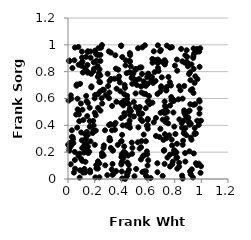
| Category | Series 0 |
|---|---|
| 0.9206579963663208 | 0.036 |
| 0.4158077181605829 | 0.157 |
| 0.3120428770809936 | 0.306 |
| 0.8353106009330821 | 0.444 |
| 0.7339869307414821 | 0.534 |
| 0.21308055101903886 | 0.079 |
| 0.28270051747507824 | 0.625 |
| 0.9456667624345371 | 0.935 |
| 0.08271187156841116 | 0.51 |
| 0.3836603406586898 | 0.765 |
| 0.5448585949675732 | 0.446 |
| 0.7635212476554524 | 0.722 |
| 0.5504686050921789 | 0.832 |
| 0.4056419928539269 | 0.329 |
| 0.48161962206379433 | 0.709 |
| 0.4021259850755091 | 0.283 |
| 0.7273541224507231 | 0.544 |
| 0.2598293609247199 | 0.665 |
| 0.8530634626550466 | 0.417 |
| 0.45638774144367006 | 0.557 |
| 0.30821040089644225 | 0.403 |
| 0.7743683591543493 | 0.611 |
| 0.46207957422139495 | 0.882 |
| 0.23543787546274828 | 0.013 |
| 0.9670457039037931 | 0.104 |
| 0.4400476172596531 | 0.789 |
| 0.4431681908915374 | 0.595 |
| 0.23539181364033687 | 0.117 |
| 0.22451633668062942 | 0.078 |
| 0.4222119321072056 | 0.491 |
| 0.7659264997425803 | 0.548 |
| 0.943451809159553 | 0.191 |
| 0.1052541292295466 | 0.905 |
| 0.9285462002775313 | 0.072 |
| 0.5384748120413075 | 0.536 |
| 0.09922966054547953 | 0.347 |
| 0.949910518939072 | 0.341 |
| 0.20065670655835888 | 0.494 |
| 0.20310304100490315 | 0.626 |
| 0.8194285080062899 | 0.077 |
| 0.5844049880543402 | 0.057 |
| 0.4245124199888307 | 0.701 |
| 0.7957365921333248 | 0.583 |
| 0.5113162440353053 | 0.075 |
| 0.3892200685994344 | 0.72 |
| 0.22201160205907025 | 0.842 |
| 0.993907332759356 | 0.046 |
| 0.5468281498382376 | 0.146 |
| 0.7265102340048437 | 0.853 |
| 0.42182547996855874 | 0.633 |
| 0.9105993135475782 | 0.206 |
| 0.213982639319976 | 0.882 |
| 0.45675928131970034 | 0.069 |
| 0.6337600474479511 | 0.867 |
| 0.3308143528940674 | 0.544 |
| 0.17433334105003712 | 0.784 |
| 0.4629848237053344 | 0.524 |
| 0.465089344490737 | 0.874 |
| 0.9150889705289293 | 0.057 |
| 0.5512959611973434 | 0.645 |
| 0.4782303546606073 | 0.272 |
| 0.8705799180205531 | 0.345 |
| 0.2277124982287225 | 0.923 |
| 0.01112948284223116 | 0.229 |
| 0.05082214313926906 | 0.202 |
| 0.7855892328342527 | 0.129 |
| 0.876214572791075 | 0.867 |
| 0.5985813824788243 | 0.375 |
| 0.5939450579727724 | 0.184 |
| 0.15911137667687214 | 0.203 |
| 0.871272367851718 | 0.511 |
| 0.06389019896030526 | 0.695 |
| 0.7648062874689028 | 0.181 |
| 0.023321956539000453 | 0.247 |
| 0.3470115873342328 | 0.404 |
| 0.4431112977337718 | 0.046 |
| 0.4718060592533276 | 0.507 |
| 0.7792253778191666 | 0.983 |
| 0.12958702128835503 | 0.826 |
| 0.24168110020162487 | 0.653 |
| 0.10893347105673439 | 0.516 |
| 0.8910697622226316 | 0.873 |
| 0.37617730925346315 | 0.815 |
| 0.1996728586670031 | 0.601 |
| 0.7254110164333968 | 0.491 |
| 0.15147871556221507 | 0.193 |
| 0.9504573136855049 | 0.38 |
| 0.1352611008309799 | 0.91 |
| 0.39672147773410876 | 0.279 |
| 0.538240381553302 | 0.831 |
| 0.11910773708450931 | 0.197 |
| 0.9423875325477266 | 0.82 |
| 0.46391360395979586 | 0.938 |
| 0.8130478310451714 | 0.198 |
| 0.3207285795626817 | 0.942 |
| 0.9661767191671596 | 0.949 |
| 0.29467048754694347 | 0.029 |
| 0.4660287046007808 | 0.923 |
| 0.32213281223442497 | 0.746 |
| 0.464483341374274 | 0.478 |
| 0.08434316095264624 | 0.431 |
| 0.5570111082573587 | 0.432 |
| 0.0013983276838097289 | 0.255 |
| 0.9801957261488091 | 0.402 |
| 0.77238509620792 | 0.697 |
| 0.8185539464837522 | 0.161 |
| 0.7961214594318241 | 0.212 |
| 0.5915672727278681 | 0.396 |
| 0.4207207834494755 | 0.469 |
| 0.008671611902048957 | 0.882 |
| 0.9076809227668415 | 0.782 |
| 0.5973254152104879 | 0.44 |
| 0.780407533987411 | 0.25 |
| 0.7453705278236127 | 0.502 |
| 0.9545694579969923 | 0.765 |
| 0.41908205053970743 | 0.204 |
| 0.028572492882195547 | 0.363 |
| 0.5055852287548122 | 0.815 |
| 0.26714268041988587 | 0.176 |
| 0.188762867013501 | 0.433 |
| 0.5934806583749638 | 0.01 |
| 0.24109285320952015 | 0.722 |
| 0.3550657296688981 | 0.922 |
| 0.1392213864366592 | 0.579 |
| 0.6860443283646659 | 0.313 |
| 0.7976810002735821 | 0.214 |
| 0.6931102946344303 | 0.374 |
| 0.9372300836659356 | 0.011 |
| 0.047436343731645805 | 0.885 |
| 0.1686045664436286 | 0.281 |
| 0.07773162321682887 | 0.984 |
| 0.6502205833137428 | 0.797 |
| 0.16388107222321982 | 0.432 |
| 0.5916074672103301 | 0.205 |
| 0.35937850822188167 | 0.823 |
| 0.5073067200827881 | 0.738 |
| 0.36444032194835047 | 0.673 |
| 0.7192081990578212 | 0.211 |
| 0.9868696673002595 | 0.578 |
| 0.7855783872839376 | 0.592 |
| 0.7652555576892625 | 0.979 |
| 0.776165934141316 | 0.586 |
| 0.35228363453854306 | 0.367 |
| 0.5475645310159162 | 0.237 |
| 0.633040521982832 | 0.569 |
| 0.3418507172043201 | 0.04 |
| 0.9919981623937305 | 0.974 |
| 0.8902206409227389 | 0.456 |
| 0.11946615598448743 | 0.242 |
| 0.014706523977364133 | 0.269 |
| 0.3482252125675912 | 0.747 |
| 0.05156671501705661 | 0.141 |
| 0.10430662320487442 | 0.95 |
| 0.5832718326707551 | 0.528 |
| 0.11552126947045749 | 0.44 |
| 0.47119522743714926 | 0.839 |
| 0.73743510612054 | 0.663 |
| 0.790652566889027 | 0.496 |
| 0.8722488884327231 | 0.494 |
| 0.8551936512262877 | 0.382 |
| 0.16608359542920462 | 0.05 |
| 0.6699656102208051 | 0.117 |
| 0.22355861151065476 | 0.761 |
| 0.5335369972331315 | 0.746 |
| 0.7239735480127207 | 0.885 |
| 0.01242114049879411 | 0.254 |
| 0.11399079384010528 | 0.048 |
| 0.8597936148239469 | 0.599 |
| 0.05174462197871446 | 0.98 |
| 0.9261837409893687 | 0.293 |
| 0.5476247493034484 | 0.69 |
| 0.5966442560685067 | 0.101 |
| 0.8176953290144803 | 0.263 |
| 0.3113626856784867 | 0.732 |
| 0.41518312664218365 | 0.548 |
| 0.828466058964925 | 0.594 |
| 0.44400986097414835 | 0.028 |
| 0.19077291116862613 | 0.362 |
| 0.9857452448741214 | 0.487 |
| 0.3629446221023996 | 0.576 |
| 0.04059397370999288 | 0.268 |
| 0.833513774909527 | 0.121 |
| 0.00949074450988487 | 0.878 |
| 0.8991664953540845 | 0.841 |
| 0.45917447784559895 | 0.795 |
| 0.567790546217495 | 0.728 |
| 0.25486612900514477 | 0.171 |
| 0.7100086873464799 | 0.023 |
| 0.8486050718433689 | 0.969 |
| 0.5072686861812367 | 0.537 |
| 0.4514125281295127 | 0.175 |
| 0.035258049893647316 | 0.313 |
| 0.14881695883233734 | 0.567 |
| 0.2544600397124745 | 0.193 |
| 0.24282285512297874 | 0.88 |
| 0.03313562704283693 | 0.827 |
| 0.10384617373136162 | 0.288 |
| 0.20817430101732778 | 0.475 |
| 0.601839856168552 | 0.785 |
| 0.9030839541253202 | 0.503 |
| 0.30762320166936974 | 0.602 |
| 0.1345953510054321 | 0.301 |
| 0.8686235899519622 | 0.436 |
| 0.5291100003794487 | 0.508 |
| 0.4401346430826675 | 0.397 |
| 0.13760687766853316 | 0.265 |
| 0.4282246540133211 | 0.001 |
| 0.029033800279547956 | 0.314 |
| 0.9321137079429141 | 0.669 |
| 0.1855814386240499 | 0.343 |
| 0.07971540379036841 | 0.852 |
| 0.2255815960989776 | 0.53 |
| 0.9531098551068639 | 0.557 |
| 0.5165390090018145 | 0.701 |
| 0.5985806582909211 | 0.448 |
| 0.9067126751497371 | 0.423 |
| 0.4374387231984106 | 0.013 |
| 0.5850731509307061 | 0.025 |
| 0.2522389919843574 | 0.602 |
| 0.6919926908393915 | 0.651 |
| 0.020789694825383714 | 0.623 |
| 0.8803266171534851 | 0.379 |
| 0.45839233795772527 | 0.412 |
| 0.859748807996846 | 0.004 |
| 0.07793085686396868 | 0.173 |
| 0.9119936054350752 | 0.51 |
| 0.7458391047432884 | 0.16 |
| 0.010131367339377554 | 0.211 |
| 0.1311258255084955 | 0.128 |
| 0.6257990167693787 | 0.738 |
| 0.24259745923959905 | 0.772 |
| 0.13640831368471298 | 0.62 |
| 0.12792530246459943 | 0.049 |
| 0.6597232990980351 | 0.321 |
| 0.1248874718033443 | 0.256 |
| 0.6594583139827579 | 0.455 |
| 0.09068123108904709 | 0.709 |
| 0.7032388616892022 | 0.758 |
| 0.9182616481753186 | 0.737 |
| 0.6381316520127092 | 0.716 |
| 0.5296275658964578 | 0.519 |
| 0.9105090175069699 | 0.424 |
| 0.4425435414763776 | 0.567 |
| 0.0866948743139844 | 0.189 |
| 0.14123030872942785 | 0.22 |
| 0.40604260128188824 | 0.129 |
| 0.17593335363351154 | 0.691 |
| 0.10671178940783553 | 0.231 |
| 0.8332513183664992 | 0.092 |
| 0.07159536624132712 | 0.598 |
| 0.5843928676573507 | 0.694 |
| 0.14944804154111227 | 0.241 |
| 0.7243217582553553 | 0.113 |
| 0.10230535087278184 | 0.844 |
| 0.5683811143086209 | 0.699 |
| 0.1437617036100868 | 0.802 |
| 0.7855983068391169 | 0.58 |
| 0.2021412746206983 | 0.956 |
| 0.8798821942164814 | 0.922 |
| 0.6292569843384186 | 0.76 |
| 0.6746347049807131 | 0.828 |
| 0.7421063605363283 | 0.687 |
| 0.4771846751334685 | 0.753 |
| 0.9499151368108258 | 0.335 |
| 0.16300788346144007 | 0.531 |
| 0.3998251970516201 | 0.108 |
| 0.777720939244854 | 0.294 |
| 0.8556736177022598 | 0.025 |
| 0.643419228487848 | 0.952 |
| 0.8600180471936898 | 0.255 |
| 0.5255871449472829 | 0.975 |
| 0.4033472744368696 | 0.056 |
| 0.5992613074361208 | 0.711 |
| 0.4493633143214666 | 0.048 |
| 0.8165725938891432 | 0.89 |
| 0.20109473789649027 | 0.255 |
| 0.8125536610122756 | 0.156 |
| 0.9596028060143798 | 0.339 |
| 0.22451012079057556 | 0.633 |
| 0.5678329438056692 | 0.331 |
| 0.3213235003286398 | 0.231 |
| 0.1458538282528606 | 0.85 |
| 0.45882697701397085 | 0.506 |
| 0.8989530230667316 | 0.862 |
| 0.4395929888158241 | 0.401 |
| 0.2247103229168587 | 0.132 |
| 0.6075230161149807 | 0.618 |
| 0.8807904000166021 | 0.476 |
| 0.6709443839747424 | 0.051 |
| 0.22792700392140208 | 0.975 |
| 0.07218151176010766 | 0.519 |
| 0.6947789996579377 | 0.493 |
| 0.7529692559600895 | 0.761 |
| 0.3357804640401062 | 0.214 |
| 0.5333756241231657 | 0.531 |
| 0.4437611902699906 | 0.62 |
| 0.3930282536546783 | 0.653 |
| 0.3979048339256537 | 0.566 |
| 0.9843431064360492 | 0.587 |
| 0.10705634807216055 | 0.135 |
| 0.5068506320411539 | 0.737 |
| 0.7107482012018417 | 0.501 |
| 0.8864765090671368 | 0.327 |
| 0.19310792554419803 | 0.87 |
| 0.06131953134036935 | 0.48 |
| 0.5685359872448764 | 0.175 |
| 0.7375689873592028 | 0.304 |
| 0.6018575039176264 | 0.783 |
| 0.6710106002684412 | 0.634 |
| 0.3984367131045802 | 0.994 |
| 0.5581555108955356 | 0.052 |
| 0.49328177648781885 | 0.574 |
| 0.7320139701004647 | 0.425 |
| 0.31872583789119574 | 0.409 |
| 0.9688941262517016 | 0.434 |
| 0.7247219801035383 | 0.578 |
| 0.8779527885614529 | 0.193 |
| 0.2774300906929792 | 0.363 |
| 0.8898728701923683 | 0.96 |
| 0.10828657290868919 | 0.874 |
| 0.26926839993949303 | 0.251 |
| 0.5721598136781618 | 0.057 |
| 0.19559308118333968 | 0.822 |
| 0.5338910286595773 | 0.486 |
| 0.6015711562240776 | 0.14 |
| 0.42156888217372457 | 0.243 |
| 0.05290609104027257 | 0.077 |
| 0.3105308120922005 | 0.645 |
| 0.6050480853201528 | 0.579 |
| 0.7367857562721403 | 0.659 |
| 0.9973785953215607 | 0.434 |
| 0.3987237573573671 | 0.992 |
| 0.2140654445466696 | 0.928 |
| 0.6434311408650671 | 0.423 |
| 0.08735828305670115 | 0.011 |
| 0.30603708744686237 | 0.951 |
| 0.06920817314970357 | 0.383 |
| 0.6998727914544386 | 0.68 |
| 0.9416386504848361 | 0.972 |
| 0.21183938293747623 | 0.104 |
| 0.12318853674436775 | 0.075 |
| 0.40046042973019474 | 0.164 |
| 0.20878297190945366 | 0.361 |
| 0.5560577484183308 | 0.487 |
| 0.19042617453663588 | 0.804 |
| 0.37806561269244426 | 0.744 |
| 0.7971104824271442 | 0.39 |
| 0.09667408300183457 | 0.563 |
| 0.14761963869336864 | 0.947 |
| 0.23107940176842498 | 0.787 |
| 0.4278539899351959 | 0.679 |
| 0.4035415102201154 | 0.185 |
| 0.5578371055817327 | 0.981 |
| 0.14835988267168787 | 0.328 |
| 0.9152554220606132 | 0.795 |
| 0.6566507129306031 | 0.731 |
| 0.1111541160748035 | 0.794 |
| 0.2350126373179629 | 0.724 |
| 0.6197458727582099 | 0.008 |
| 0.46230128930470926 | 0.437 |
| 0.857302783390963 | 0.877 |
| 0.6988826040146613 | 0.691 |
| 0.06547824833566235 | 0.704 |
| 0.1485332897872813 | 0.952 |
| 0.5337113318749944 | 0.487 |
| 0.41991523633904815 | 0.583 |
| 0.09051084717383218 | 0.065 |
| 0.360911577693665 | 0.059 |
| 0.16989027511938645 | 0.904 |
| 0.5945398608982372 | 0.759 |
| 0.6791179847356325 | 0.805 |
| 0.9169918781309558 | 0.557 |
| 0.40697378166658293 | 0.909 |
| 0.31640630739219944 | 0.289 |
| 0.9873847725314978 | 0.525 |
| 0.7949081254876003 | 0.192 |
| 0.4809704683352254 | 0.188 |
| 0.49018471693493165 | 0.786 |
| 0.5373404972083116 | 0.227 |
| 0.20514011664655846 | 0.012 |
| 0.8721010315390538 | 0.693 |
| 0.7512356976599788 | 0.414 |
| 0.7818792870094639 | 0.109 |
| 0.33602055398433667 | 0.211 |
| 0.57686004894217 | 0.996 |
| 0.6324443401991671 | 0.895 |
| 0.9389168791254736 | 0.903 |
| 0.8436919551063009 | 0.661 |
| 0.8801145311033335 | 0.13 |
| 0.9868935682931985 | 0.836 |
| 0.8019549938107934 | 0.845 |
| 0.805542409047916 | 0.335 |
| 0.9210878394301889 | 0.663 |
| 0.780229665364891 | 0.599 |
| 0.4945772727358627 | 0.466 |
| 0.715509408082112 | 0.292 |
| 0.7403156205012983 | 0.452 |
| 0.0815314129512775 | 0.481 |
| 0.49842804561322207 | 0.02 |
| 0.5075584520303256 | 0.817 |
| 0.8630736900660995 | 0.285 |
| 0.9121495395272297 | 0.404 |
| 0.29729157440694104 | 0.784 |
| 0.7318790870174974 | 0.873 |
| 0.5278687909257919 | 0.385 |
| 0.9419683058201236 | 0.553 |
| 0.2108691513490548 | 0.933 |
| 0.5684806638559528 | 0.636 |
| 0.5551449547017995 | 0.783 |
| 0.4062632648729113 | 0.004 |
| 0.4018885882445375 | 0.121 |
| 0.3007749248501847 | 0.693 |
| 0.03694296667176091 | 0.297 |
| 0.5237380890701333 | 0.274 |
| 0.6718103285347659 | 0.865 |
| 0.6743673159137573 | 0.996 |
| 0.7213931659252573 | 0.215 |
| 0.9839547939350171 | 0.95 |
| 0.8328205850358149 | 0.691 |
| 0.3568899841513345 | 0.418 |
| 0.7102347140115218 | 0.443 |
| 0.16501140962324554 | 0.065 |
| 0.44522038639957334 | 0.123 |
| 0.6107723370640755 | 0.557 |
| 0.33387018279221353 | 0.112 |
| 0.020565692733179295 | 0.11 |
| 0.29345881442468824 | 0.621 |
| 0.2660118276702779 | 0.232 |
| 0.902305368583397 | 0.458 |
| 0.3988469112783059 | 0.454 |
| 0.9803171530221629 | 0.115 |
| 0.14171651696114293 | 0.351 |
| 0.43234660801805447 | 0.885 |
| 0.431592272406884 | 0.193 |
| 0.8192383852107722 | 0.807 |
| 0.7594983204510785 | 0.326 |
| 0.10339833349059753 | 0.866 |
| 0.5092933125492373 | 0.82 |
| 0.279570338723108 | 0.102 |
| 0.2546832596303336 | 0.998 |
| 0.997781717352732 | 0.096 |
| 0.12942621125441808 | 0.333 |
| 0.6963666871909162 | 0.962 |
| 0.24819880489982227 | 0.978 |
| 0.09881315950276624 | 0.149 |
| 0.43143486517039126 | 0.847 |
| 0.7415368554733555 | 0.994 |
| 0.4555882857805377 | 0.106 |
| 0.2366952742645563 | 0.817 |
| 0.19233110362441352 | 0.399 |
| 0.14414340937282302 | 0.469 |
| 0.5607452889274825 | 0.169 |
| 0.04451352321331888 | 0.048 |
| 0.3278557754548327 | 0.071 |
| 0.970579477218177 | 0.745 |
| 0.13888582242711783 | 0.205 |
| 0.7125476201437916 | 0.87 |
| 0.4645424456450834 | 0.383 |
| 0.25659103609910516 | 0.562 |
| 0.4744230107685663 | 0.789 |
| 0.6872682552613286 | 0.876 |
| 0.5824288259065544 | 0.633 |
| 0.48299072712932756 | 0.759 |
| 0.4830049445585843 | 0.232 |
| 0.9590643493671106 | 0.117 |
| 0.5973896485937951 | 0.577 |
| 0.9670942434352623 | 0.969 |
| 0.5983256536700425 | 0.402 |
| 0.6740889551890756 | 0.891 |
| 0.3734588806432424 | 0.254 |
| 0.31064415719900845 | 0.289 |
| 0.8689994681944615 | 0.341 |
| 0.9208847742666246 | 0.412 |
| 0.8928142241307718 | 0.91 |
| 0.4119620282626743 | 0.177 |
| 0.9201090503972003 | 0.308 |
| 0.1477937695602994 | 0.792 |
| 0.6575067698840201 | 0.886 |
| 0.24360985621237366 | 0.51 |
| 0.7650743514629031 | 0.093 |
| 0.3338614578269154 | 0.031 |
| 0.4161336320940195 | 0.561 |
| 0.1686184283696371 | 0.95 |
| 0.5839529901054299 | 0.281 |
| 0.6907443334189708 | 0.953 |
| 0.24328801061722796 | 0.925 |
| 0.925867809792364 | 0.854 |
| 0.9494908385784541 | 0.716 |
| 0.5068593510902033 | 0.638 |
| 0.004268520867028132 | 0.585 |
| 0.26954984324070463 | 0.665 |
| 0.1752555847083054 | 0.683 |
| 0.9411302065014182 | 0.641 |
| 0.5522694333181991 | 0.283 |
| 0.02497987184166447 | 0.599 |
| 0.1632294678494957 | 0.389 |
| 0.7268889660304179 | 0.334 |
| 0.3297296137202529 | 0.363 |
| 0.9404107383985986 | 0.915 |
| 0.4104427586470252 | 0.399 |